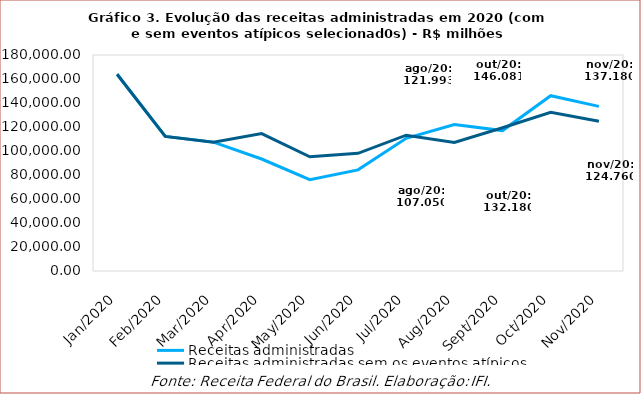
| Category | Receitas administradas | Receitas administradas sem os eventos atípicos |
|---|---|---|
| 2020-01-01 | 163948 | 163948 |
| 2020-02-01 | 112141 | 112141 |
| 2020-03-01 | 107390 | 107390 |
| 2020-04-01 | 93332 | 114525.283 |
| 2020-05-01 | 76139 | 95214.627 |
| 2020-06-01 | 84267 | 98030.657 |
| 2020-07-01 | 110540 | 113179.433 |
| 2020-08-01 | 121993 | 107050 |
| 2020-09-01 | 117022 | 119372.8 |
| 2020-10-01 | 146081 | 132180 |
| 2020-11-01 | 137180 | 124760 |